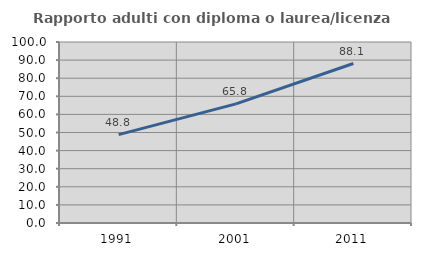
| Category | Rapporto adulti con diploma o laurea/licenza media  |
|---|---|
| 1991.0 | 48.825 |
| 2001.0 | 65.824 |
| 2011.0 | 88.107 |